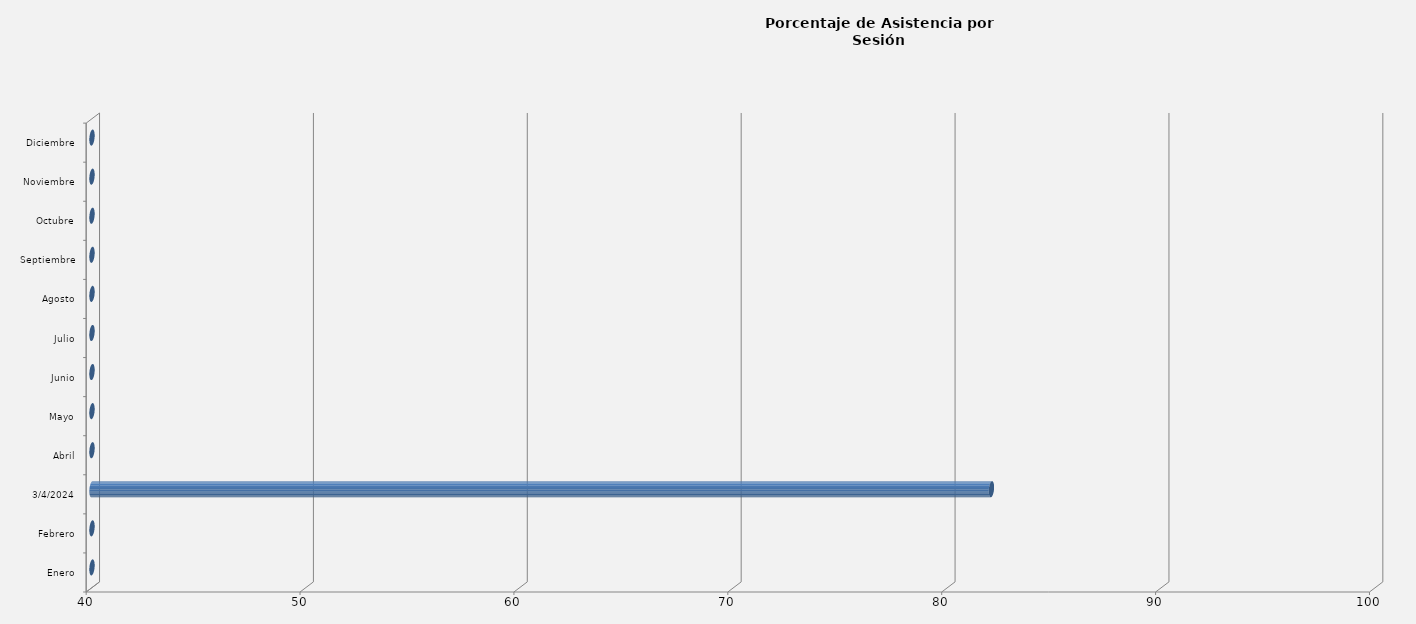
| Category | Enero |
|---|---|
| Enero | 0 |
| Febrero | 0 |
| 04/03/2024 | 82.051 |
| Abril | 0 |
| Mayo | 0 |
| Junio | 0 |
| Julio | 0 |
| Agosto | 0 |
| Septiembre | 0 |
| Octubre | 0 |
| Noviembre | 0 |
| Diciembre | 0 |